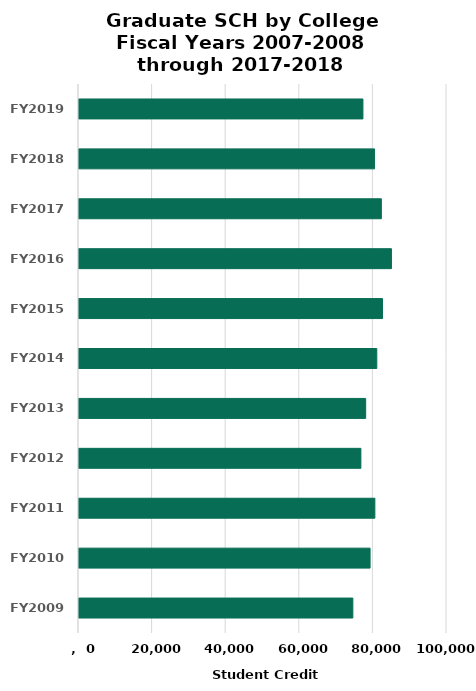
| Category | Total |
|---|---|
| FY2009 | 74687 |
| FY2010 | 79370 |
| FY2011 | 80669 |
| FY2012 | 76869 |
| FY2013 | 78173 |
| FY2014 | 81196 |
| FY2015 | 82751.22 |
| FY2016 | 85173.39 |
| FY2017 | 82432.163 |
| FY2018 | 80586.48 |
| FY2019 | 77426.737 |